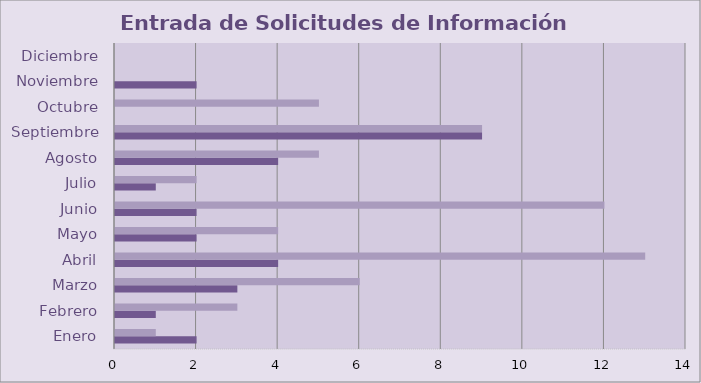
| Category | 2016 | oct-2017 |
|---|---|---|
| Enero | 2 | 1 |
| Febrero | 1 | 3 |
| Marzo | 3 | 6 |
| Abril | 4 | 13 |
| Mayo | 2 | 4 |
| Junio | 2 | 12 |
| Julio | 1 | 2 |
| Agosto | 4 | 5 |
| Septiembre | 9 | 9 |
| Octubre | 0 | 5 |
| Noviembre | 2 | 0 |
| Diciembre | 0 | 0 |